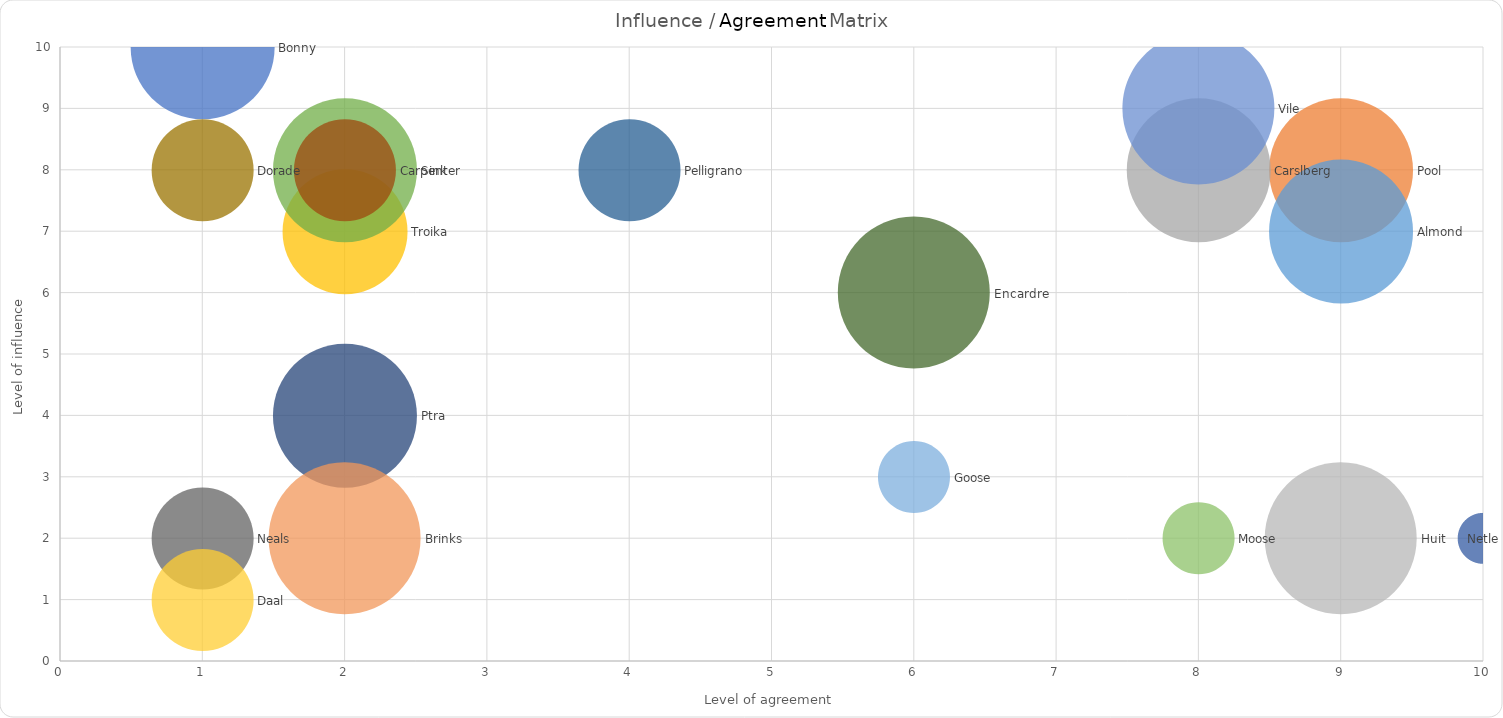
| Category | Series 0 |
|---|---|
| 1.0 | 10 |
| 9.0 | 8 |
| 8.0 | 8 |
| 2.0 | 7 |
| 9.0 | 7 |
| 2.0 | 8 |
| 2.0 | 4 |
| 2.0 | 8 |
| 1.0 | 2 |
| 1.0 | 8 |
| 4.0 | 8 |
| 6.0 | 6 |
| 8.0 | 9 |
| 2.0 | 2 |
| 9.0 | 2 |
| 1.0 | 1 |
| 6.0 | 3 |
| 8.0 | 2 |
| 10.0 | 2 |